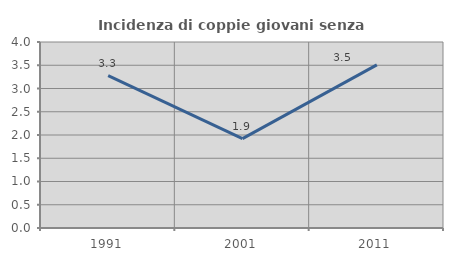
| Category | Incidenza di coppie giovani senza figli |
|---|---|
| 1991.0 | 3.279 |
| 2001.0 | 1.923 |
| 2011.0 | 3.509 |